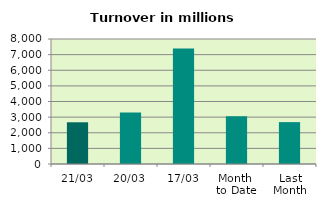
| Category | Series 0 |
|---|---|
| 21/03 | 2669.621 |
| 20/03 | 3288.983 |
| 17/03 | 7393.653 |
| Month 
to Date | 3062.762 |
| Last
Month | 2679.99 |